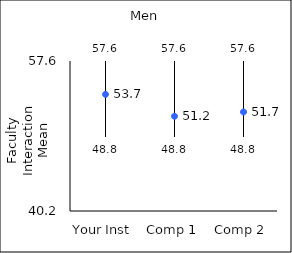
| Category | 25th percentile | 75th percentile | Mean |
|---|---|---|---|
| Your Inst | 48.8 | 57.6 | 53.73 |
| Comp 1 | 48.8 | 57.6 | 51.19 |
| Comp 2 | 48.8 | 57.6 | 51.69 |